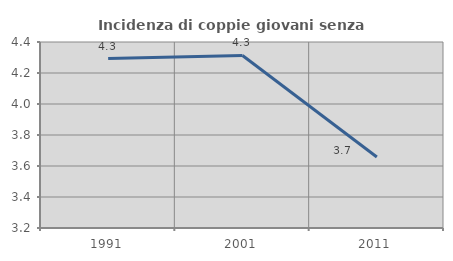
| Category | Incidenza di coppie giovani senza figli |
|---|---|
| 1991.0 | 4.293 |
| 2001.0 | 4.313 |
| 2011.0 | 3.658 |